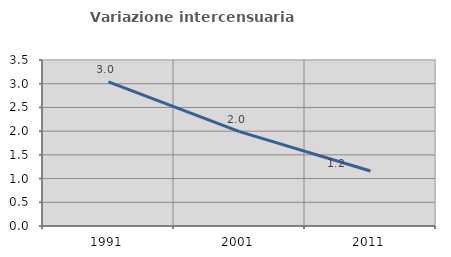
| Category | Variazione intercensuaria annua |
|---|---|
| 1991.0 | 3.04 |
| 2001.0 | 1.989 |
| 2011.0 | 1.16 |